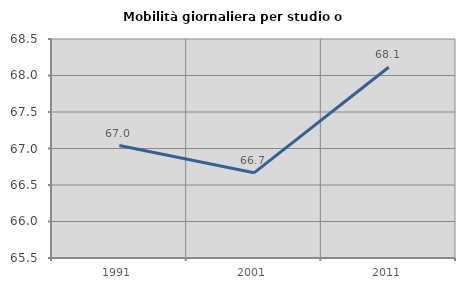
| Category | Mobilità giornaliera per studio o lavoro |
|---|---|
| 1991.0 | 67.04 |
| 2001.0 | 66.667 |
| 2011.0 | 68.114 |